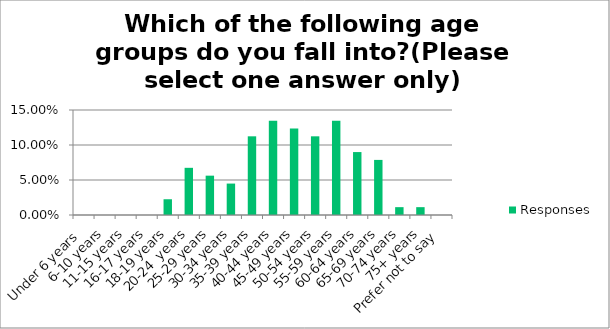
| Category | Responses |
|---|---|
| Under 6 years | 0 |
| 6-10 years | 0 |
| 11-15 years | 0 |
| 16-17 years | 0 |
| 18-19 years | 0.022 |
| 20-24  years | 0.067 |
| 25-29 years | 0.056 |
| 30-34 years | 0.045 |
| 35-39 years | 0.112 |
| 40-44 years | 0.135 |
| 45-49 years | 0.124 |
| 50-54 years | 0.112 |
| 55-59 years | 0.135 |
| 60-64 years | 0.09 |
| 65-69 years | 0.079 |
| 70-74 years | 0.011 |
| 75+ years | 0.011 |
| Prefer not to say | 0 |